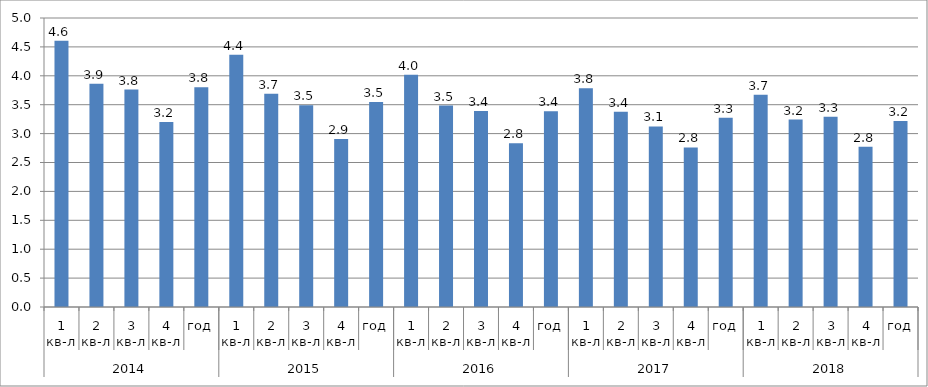
| Category | Series 0 |
|---|---|
| 0 | 4.604 |
| 1 | 3.863 |
| 2 | 3.762 |
| 3 | 3.202 |
| 4 | 3.8 |
| 5 | 4.366 |
| 6 | 3.689 |
| 7 | 3.49 |
| 8 | 2.906 |
| 9 | 3.546 |
| 10 | 4.018 |
| 11 | 3.484 |
| 12 | 3.393 |
| 13 | 2.831 |
| 14 | 3.386 |
| 15 | 3.783 |
| 16 | 3.38 |
| 17 | 3.125 |
| 18 | 2.761 |
| 19 | 3.274 |
| 20 | 3.673 |
| 21 | 3.244 |
| 22 | 3.291 |
| 23 | 2.774 |
| 24 | 3.218 |